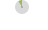
| Category | Datos | Series 3 | Series 1 |
|---|---|---|---|
| no | 125 | 125 | 125 |
| si | 450 | 450 | 450 |